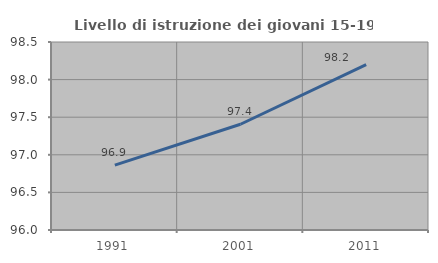
| Category | Livello di istruzione dei giovani 15-19 anni |
|---|---|
| 1991.0 | 96.862 |
| 2001.0 | 97.406 |
| 2011.0 | 98.201 |